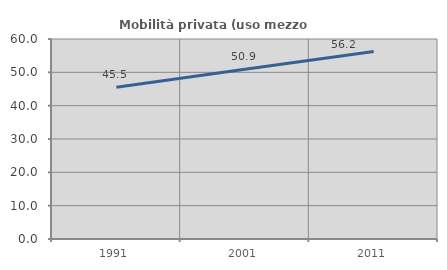
| Category | Mobilità privata (uso mezzo privato) |
|---|---|
| 1991.0 | 45.533 |
| 2001.0 | 50.9 |
| 2011.0 | 56.239 |